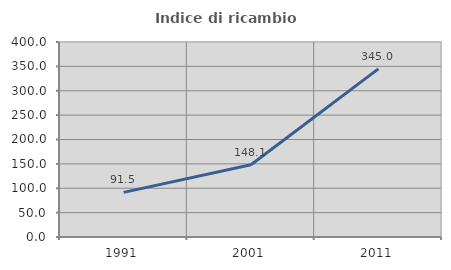
| Category | Indice di ricambio occupazionale  |
|---|---|
| 1991.0 | 91.506 |
| 2001.0 | 148.063 |
| 2011.0 | 344.966 |